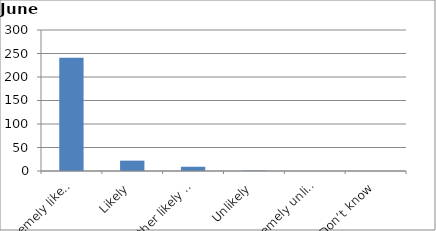
| Category | Series 0 |
|---|---|
| Extremely likely | 241 |
| Likely | 22 |
| Neither likely nor unlikely | 9 |
| Unlikely | 1 |
| Extremely unlikely | 0 |
| Don’t know | 0 |